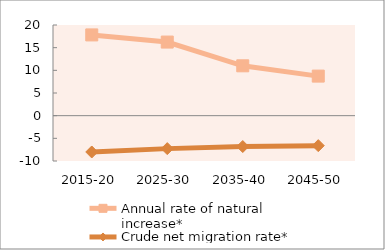
| Category | Annual rate of natural increase* | Crude net migration rate* |
|---|---|---|
| 2015-20 | 17.812 | -8.012 |
| 2025-30 | 16.235 | -7.27 |
| 2035-40 | 10.999 | -6.808 |
| 2045-50 | 8.726 | -6.612 |